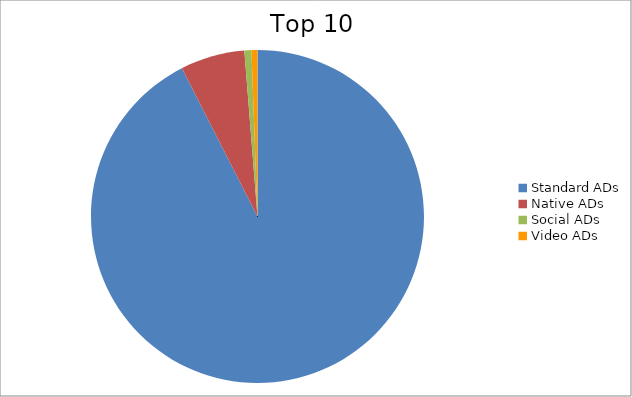
| Category | Series 0 |
|---|---|
| Standard ADs | 92.5 |
| Native ADs | 6.24 |
| Social ADs | 0.68 |
| Video ADs | 0.58 |